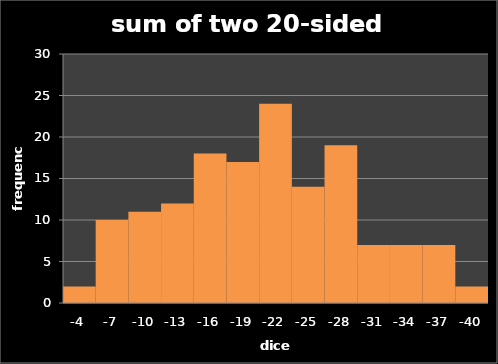
| Category | freq1 |
|---|---|
| -4.0 | 2 |
| -7.0 | 10 |
| -10.0 | 11 |
| -13.0 | 12 |
| -16.0 | 18 |
| -19.0 | 17 |
| -22.0 | 24 |
| -25.0 | 14 |
| -28.0 | 19 |
| -31.0 | 7 |
| -34.0 | 7 |
| -37.0 | 7 |
| -40.0 | 2 |